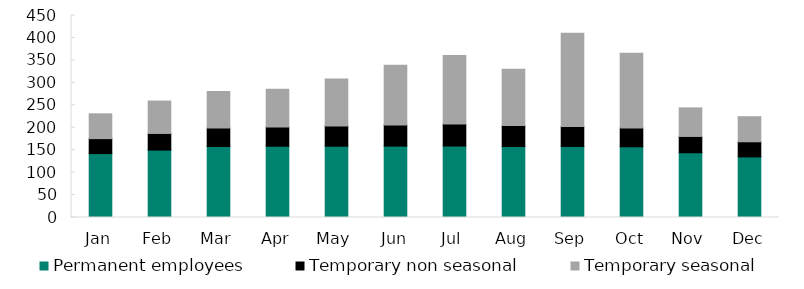
| Category | Permanent employees | Temporary non seasonal | Temporary seasonal  |
|---|---|---|---|
| Jan | 142.361 | 33.33 | 55.262 |
| Feb | 150.172 | 37.084 | 72.143 |
| Mar | 158.131 | 41.267 | 81.164 |
| Apr | 158.782 | 43.065 | 84.058 |
| May | 158.789 | 45.088 | 104.723 |
| Jun | 159.028 | 47.143 | 132.952 |
| Jul | 159.227 | 48.963 | 152.89 |
| Aug | 158.192 | 46.519 | 125.605 |
| Sep | 158.361 | 44.214 | 207.889 |
| Oct | 157.552 | 42.1 | 166.073 |
| Nov | 144.21 | 36.396 | 63.599 |
| Dec | 134.982 | 33.718 | 55.829 |